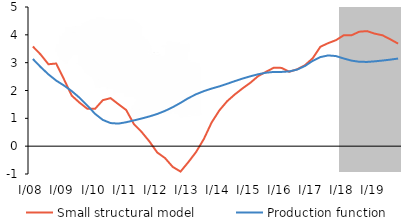
| Category | Small structural model | Production function |
|---|---|---|
| I/08 | 3.581 | 3.132 |
| II | 3.292 | 2.843 |
| III | 2.943 | 2.58 |
| IV | 2.969 | 2.356 |
| I/09 | 2.403 | 2.18 |
| II | 1.816 | 1.979 |
| III | 1.564 | 1.74 |
| IV | 1.344 | 1.462 |
| I/10 | 1.341 | 1.161 |
| II | 1.653 | 0.943 |
| III | 1.725 | 0.83 |
| IV | 1.509 | 0.811 |
| I/11 | 1.302 | 0.859 |
| II | 0.793 | 0.926 |
| III | 0.508 | 0.994 |
| IV | 0.169 | 1.068 |
| I/12 | -0.227 | 1.156 |
| II | -0.427 | 1.267 |
| III | -0.745 | 1.401 |
| IV | -0.913 | 1.556 |
| I/13 | -0.576 | 1.724 |
| II | -0.21 | 1.865 |
| III | 0.256 | 1.978 |
| IV | 0.85 | 2.069 |
| I/14 | 1.286 | 2.149 |
| II | 1.616 | 2.241 |
| III | 1.862 | 2.339 |
| IV | 2.08 | 2.43 |
| I/15 | 2.281 | 2.511 |
| II | 2.52 | 2.584 |
| III | 2.672 | 2.64 |
| IV | 2.817 | 2.668 |
| I/16 | 2.812 | 2.667 |
| II | 2.673 | 2.686 |
| III | 2.762 | 2.75 |
| IV | 2.906 | 2.879 |
| I/17 | 3.156 | 3.063 |
| II | 3.572 | 3.201 |
| III | 3.702 | 3.26 |
| IV | 3.808 | 3.237 |
| I/18 | 3.984 | 3.15 |
| II | 3.984 | 3.073 |
| III | 4.113 | 3.032 |
| IV | 4.133 | 3.027 |
| I/19 | 4.042 | 3.048 |
| II | 3.982 | 3.076 |
| III | 3.838 | 3.109 |
| IV | 3.684 | 3.148 |